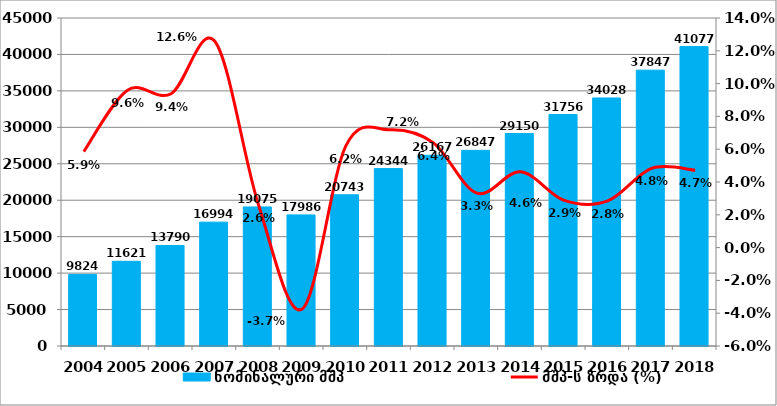
| Category | ნომინალური მშპ |
|---|---|
| 2004.0 | 9824.295 |
| 2005.0 | 11620.942 |
| 2006.0 | 13789.913 |
| 2007.0 | 16993.779 |
| 2008.0 | 19074.852 |
| 2009.0 | 17985.955 |
| 2010.0 | 20743.364 |
| 2011.0 | 24343.987 |
| 2012.0 | 26167.284 |
| 2013.0 | 26847.354 |
| 2014.0 | 29150.481 |
| 2015.0 | 31755.556 |
| 2016.0 | 34028.452 |
| 2017.0 | 37846.618 |
| 2018.0 | 41077.457 |